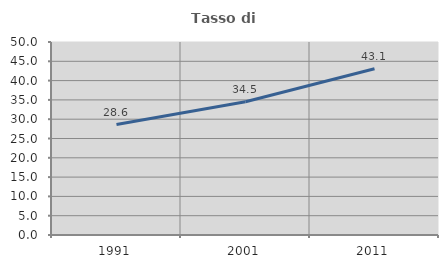
| Category | Tasso di occupazione   |
|---|---|
| 1991.0 | 28.607 |
| 2001.0 | 34.534 |
| 2011.0 | 43.083 |